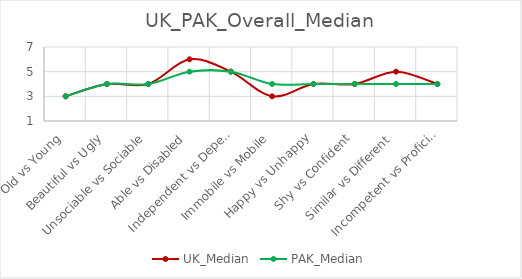
| Category | UK_Median | PAK_Median |
|---|---|---|
| Old vs Young | 3 | 3 |
|  Beautiful vs Ugly | 4 | 4 |
| Unsociable vs Sociable | 4 | 4 |
| Able vs Disabled | 6 | 5 |
| Independent vs Dependent | 5 | 5 |
| Immobile vs Mobile | 3 | 4 |
| Happy vs Unhappy | 4 | 4 |
| Shy vs Confident | 4 | 4 |
| Similar vs Different | 5 | 4 |
| Incompetent vs Proficient | 4 | 4 |